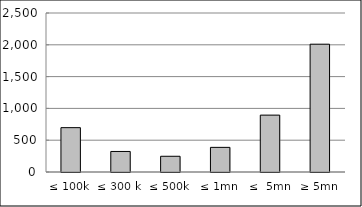
| Category | Series 0 |
|---|---|
| ≤ 100k | 697473991.134 |
| ≤ 300 k | 322913693.033 |
| ≤ 500k | 247222055.94 |
| ≤ 1mn | 387251794.37 |
| ≤  5mn | 894323348.845 |
| ≥ 5mn | 2009487336.207 |